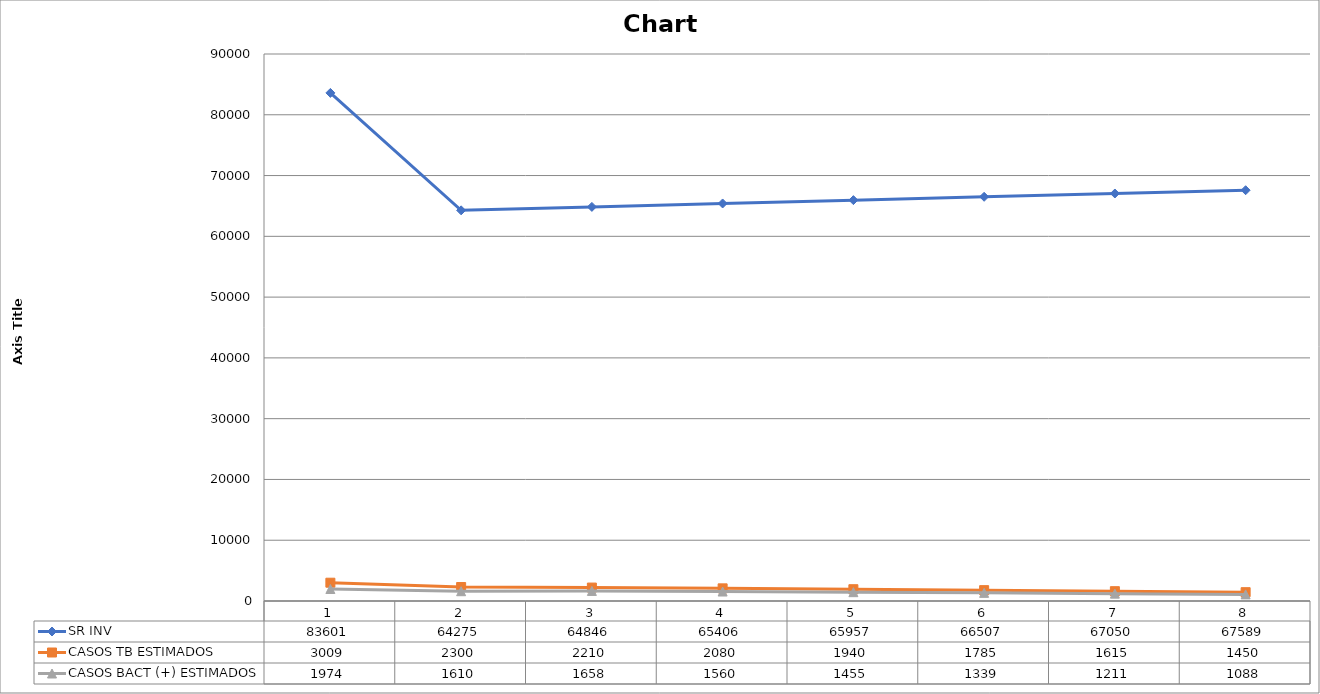
| Category | SR INV | CASOS TB ESTIMADOS | CASOS BACT (+) ESTIMADOS |
|---|---|---|---|
| 0 | 83601 | 3009 | 1974 |
| 1 | 64275 | 2300 | 1610 |
| 2 | 64846 | 2210 | 1658 |
| 3 | 65406 | 2080 | 1560 |
| 4 | 65957 | 1940 | 1455 |
| 5 | 66507 | 1785 | 1339 |
| 6 | 67050 | 1615 | 1211 |
| 7 | 67589 | 1450 | 1088 |